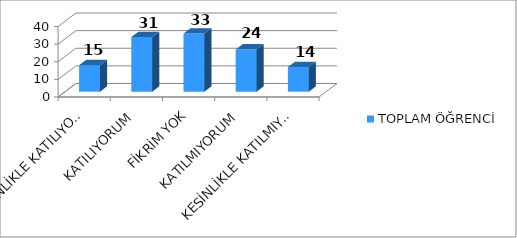
| Category | TOPLAM ÖĞRENCİ |
|---|---|
| KESİNLİKLE KATILIYORUM | 15 |
| KATILIYORUM | 31 |
| FİKRİM YOK | 33 |
| KATILMIYORUM | 24 |
| KESİNLİKLE KATILMIYORUM | 14 |